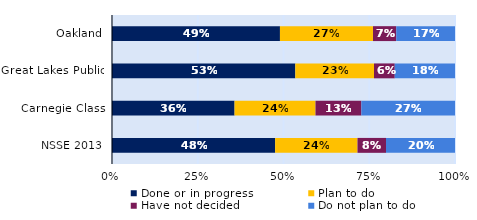
| Category | Done or in progress | Plan to do | Have not decided | Do not plan to do |
|---|---|---|---|---|
| Oakland | 0.49 | 0.271 | 0.068 | 0.171 |
| Great Lakes Public | 0.534 | 0.229 | 0.06 | 0.176 |
| Carnegie Class | 0.357 | 0.236 | 0.134 | 0.273 |
| NSSE 2013 | 0.476 | 0.24 | 0.083 | 0.201 |